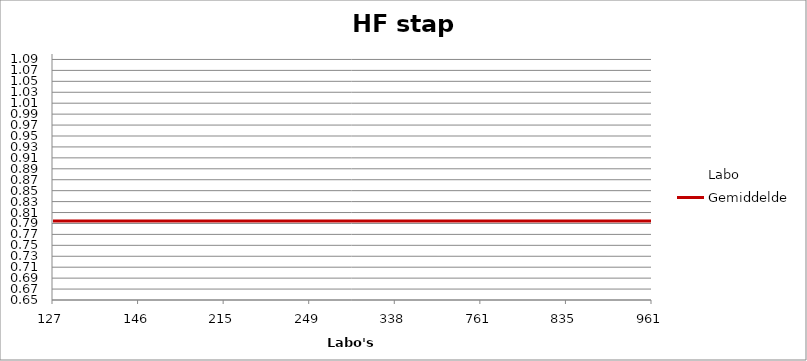
| Category | Labo | Gemiddelde |
|---|---|---|
| 127.0 | 0.71 | 0.794 |
| 146.0 | 0.757 | 0.794 |
| 215.0 | 1.004 | 0.794 |
| 249.0 | 0.662 | 0.794 |
| 338.0 | 0.792 | 0.794 |
| 761.0 | 0.857 | 0.794 |
| 835.0 | 0.651 | 0.794 |
| 961.0 | 0.922 | 0.794 |